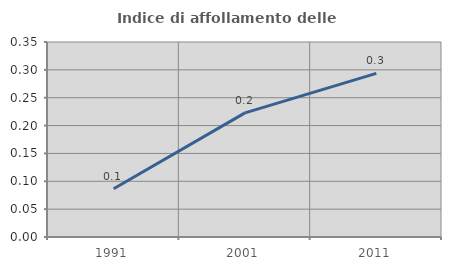
| Category | Indice di affollamento delle abitazioni  |
|---|---|
| 1991.0 | 0.087 |
| 2001.0 | 0.223 |
| 2011.0 | 0.294 |